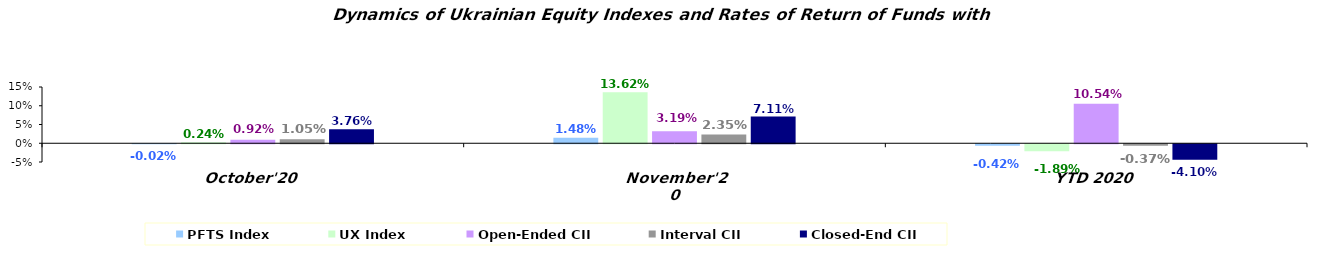
| Category | PFTS Index | UX Index | Open-Ended CII | Interval CII | Closed-End CII |
|---|---|---|---|---|---|
| October'20 | 0 | 0.002 | 0.009 | 0.011 | 0.038 |
| November'20 | 0.015 | 0.136 | 0.032 | 0.023 | 0.071 |
| YTD 2020 | -0.004 | -0.019 | 0.105 | -0.004 | -0.041 |